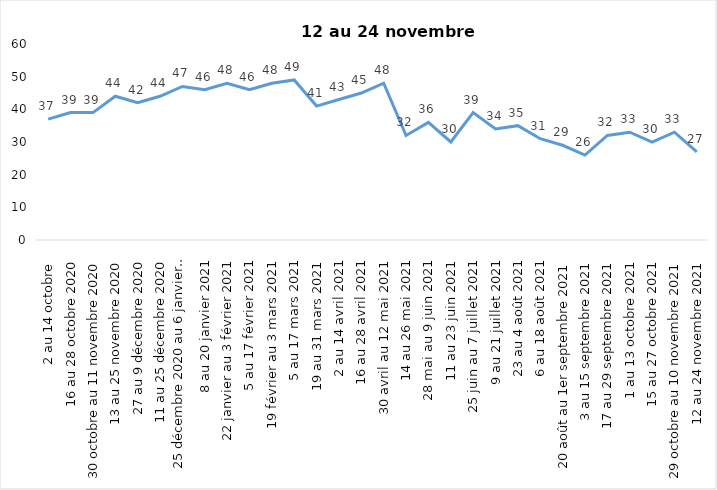
| Category | Toujours aux trois mesures |
|---|---|
| 2 au 14 octobre  | 37 |
| 16 au 28 octobre 2020 | 39 |
| 30 octobre au 11 novembre 2020 | 39 |
| 13 au 25 novembre 2020 | 44 |
| 27 au 9 décembre 2020 | 42 |
| 11 au 25 décembre 2020 | 44 |
| 25 décembre 2020 au 6 janvier  2021 | 47 |
| 8 au 20 janvier 2021 | 46 |
| 22 janvier au 3 février 2021 | 48 |
| 5 au 17 février 2021 | 46 |
| 19 février au 3 mars 2021 | 48 |
| 5 au 17 mars 2021 | 49 |
| 19 au 31 mars 2021 | 41 |
| 2 au 14 avril 2021 | 43 |
| 16 au 28 avril 2021 | 45 |
| 30 avril au 12 mai 2021 | 48 |
| 14 au 26 mai 2021 | 32 |
| 28 mai au 9 juin 2021 | 36 |
| 11 au 23 juin 2021 | 30 |
| 25 juin au 7 juillet 2021 | 39 |
| 9 au 21 juillet 2021 | 34 |
| 23 au 4 août 2021 | 35 |
| 6 au 18 août 2021 | 31 |
| 20 août au 1er septembre 2021 | 29 |
| 3 au 15 septembre 2021 | 26 |
| 17 au 29 septembre 2021 | 32 |
| 1 au 13 octobre 2021 | 33 |
| 15 au 27 octobre 2021 | 30 |
| 29 octobre au 10 novembre 2021 | 33 |
| 12 au 24 novembre 2021 | 27 |